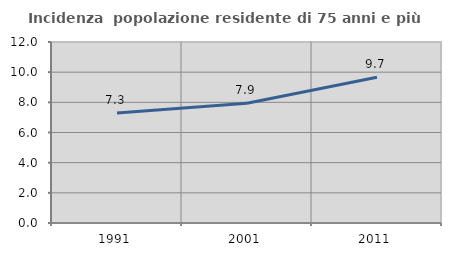
| Category | Incidenza  popolazione residente di 75 anni e più |
|---|---|
| 1991.0 | 7.299 |
| 2001.0 | 7.937 |
| 2011.0 | 9.666 |